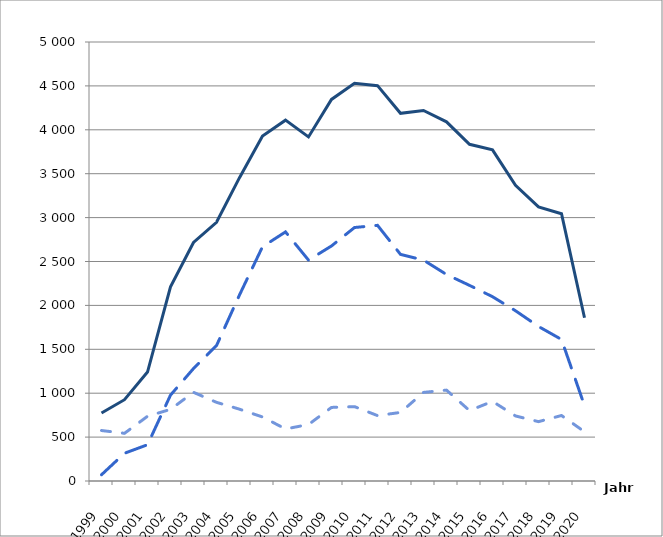
| Category | Series 0 | Series 1 | Series 2 |
|---|---|---|---|
| 1999.0 | 775 | 575 | 71 |
| 2000.0 | 926 | 543 | 316 |
| 2001.0 | 1241 | 737 | 413 |
| 2002.0 | 2211 | 816 | 978 |
| 2003.0 | 2717 | 1010 | 1281 |
| 2004.0 | 2947 | 896 | 1542 |
| 2005.0 | 3455 | 818 | 2119 |
| 2006.0 | 3929 | 729 | 2668 |
| 2007.0 | 4110 | 593 | 2837 |
| 2008.0 | 3919 | 643 | 2516 |
| 2009.0 | 4346 | 838 | 2677 |
| 2010.0 | 4530 | 847 | 2887 |
| 2011.0 | 4503 | 745 | 2912 |
| 2012.0 | 4188 | 781 | 2581 |
| 2013.0 | 4220 | 1009 | 2516 |
| 2014.0 | 4091 | 1035 | 2352 |
| 2015.0 | 3835 | 802 | 2228 |
| 2016.0 | 3772 | 907 | 2099 |
| 2017.0 | 3367 | 741 | 1939 |
| 2018.0 | 3122 | 676 | 1760 |
| 2019.0 | 3044 | 746 | 1612 |
| 2020.0 | 1859 | 561 | 858 |